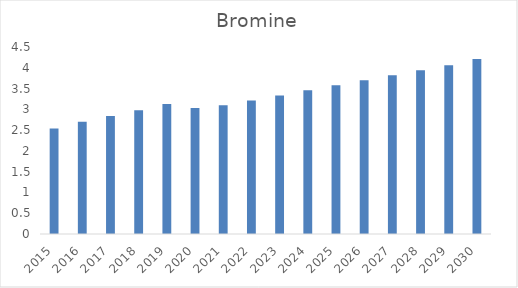
| Category | Bromine |
|---|---|
| 2015.0 | 2.54 |
| 2016.0 | 2.7 |
| 2017.0 | 2.84 |
| 2018.0 | 2.98 |
| 2019.0 | 3.13 |
| 2020.0 | 3.03 |
| 2021.0 | 3.1 |
| 2022.0 | 3.21 |
| 2023.0 | 3.33 |
| 2024.0 | 3.46 |
| 2025.0 | 3.58 |
| 2026.0 | 3.7 |
| 2027.0 | 3.82 |
| 2028.0 | 3.94 |
| 2029.0 | 4.06 |
| 2030.0 | 4.21 |